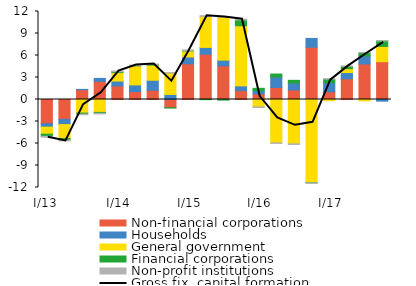
| Category | Non-financial corporations | Households | General government | Financial corporations | Non-profit institutions |
|---|---|---|---|---|---|
| I/13 | -3.311 | -0.458 | -0.959 | -0.298 | -0.115 |
| II | -2.72 | -0.704 | -1.906 | -0.213 | -0.1 |
| III | 1.327 | 0.053 | -1.854 | -0.138 | -0.085 |
|  IV | 2.469 | 0.408 | -1.759 | -0.126 | -0.085 |
|  I/14 | 1.849 | 0.665 | 1.157 | 0.113 | 0.097 |
| II | 1.069 | 0.924 | 2.592 | 0.032 | 0.075 |
| III | 1.255 | 1.369 | 2.059 | 0.071 | 0.084 |
|  IV | -1.115 | 0.689 | 2.915 | -0.051 | 0.067 |
|  I/15 | 4.865 | 0.934 | 0.823 | 0.019 | 0.116 |
| II | 6.177 | 0.926 | 4.233 | -0.024 | 0.098 |
| III | 4.588 | 0.78 | 5.852 | -0.081 | 0.102 |
| IV | 1.215 | 0.646 | 8.194 | 0.79 | 0.101 |
|  I/16 | 0.77 | 0.428 | -1.006 | 0.327 | -0.087 |
| II | 1.648 | 1.429 | -5.913 | 0.397 | -0.068 |
| III | 1.306 | 0.941 | -6.049 | 0.363 | -0.083 |
| IV | 7.122 | 1.206 | -11.328 | -0.027 | -0.082 |
|  I/17 | 1.056 | 1.242 | -0.165 | 0.483 | 0.018 |
| II | 2.811 | 0.864 | 0.53 | 0.322 | 0.023 |
| III | 4.845 | 1.093 | -0.183 | 0.434 | 0.018 |
| IV | 5.155 | -0.226 | 2.081 | 0.748 | 0.02 |